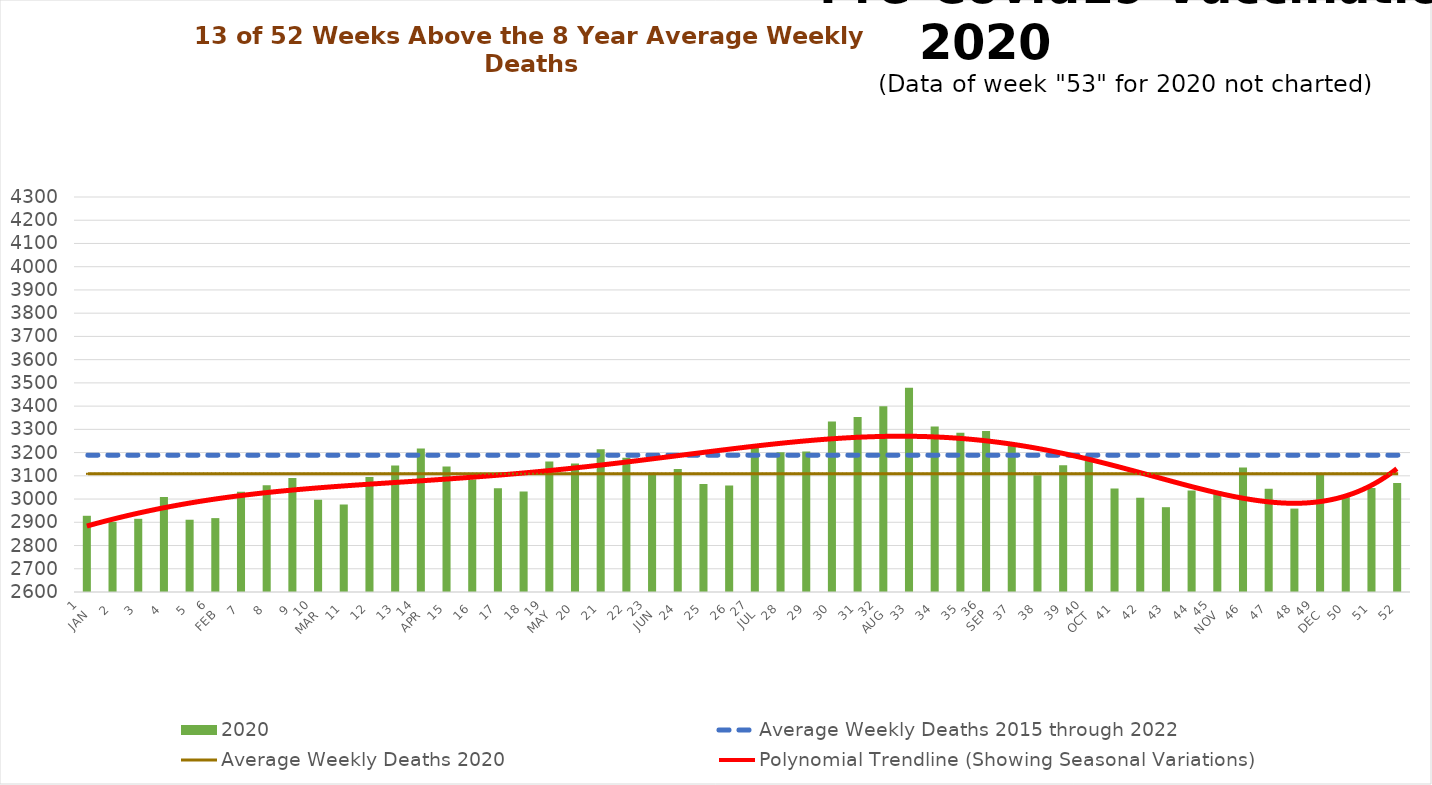
| Category | 2020 |
|---|---|
| 1
JAN | 2928 |
| 2 | 2902 |
| 3 | 2915 |
| 4 | 3009 |
| 5 | 2911 |
| 6
FEB | 2918 |
| 7 | 3031 |
| 8 | 3059 |
| 9 | 3091 |
| 10
MAR | 2997 |
| 11 | 2977 |
| 12 | 3095 |
| 13 | 3144 |
| 14
APR | 3218 |
| 15 | 3140 |
| 16 | 3084 |
| 17 | 3046 |
| 18 | 3032 |
| 19
MAY | 3162 |
| 20 | 3153 |
| 21 | 3214 |
| 22 | 3178 |
| 23
JUN | 3113 |
| 24 | 3129 |
| 25 | 3065 |
| 26 | 3058 |
| 27
JUL | 3221 |
| 28 | 3201 |
| 29 | 3205 |
| 30 | 3334 |
| 31 | 3353 |
| 32
AUG | 3399 |
| 33 | 3479 |
| 34 | 3312 |
| 35 | 3285 |
| 36
SEP | 3293 |
| 37 | 3239 |
| 38 | 3102 |
| 39 | 3146 |
| 40
OCT | 3189 |
| 41 | 3045 |
| 42 | 3006 |
| 43 | 2965 |
| 44 | 3037 |
| 45
NOV | 3035 |
| 46 | 3136 |
| 47 | 3044 |
| 48 | 2959 |
| 49
DEC | 3108 |
| 50 | 3008 |
| 51 | 3048 |
| 52 | 3069 |